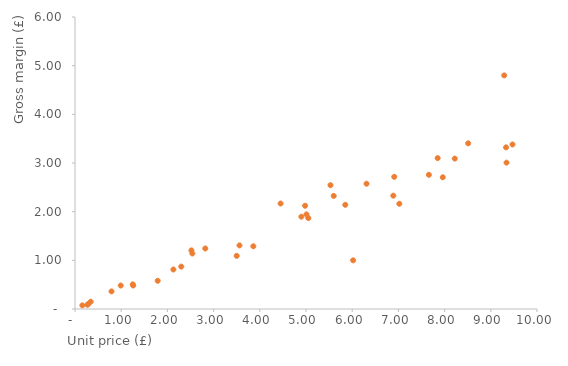
| Category |  Gross margin  |
|---|---|
| 3.56 | 1.307 |
| 6.89 | 2.329 |
| 3.86 | 1.289 |
| 5.01 | 1.944 |
| 4.98 | 2.121 |
| 0.29 | 0.107 |
| 6.91 | 2.716 |
| 2.54 | 1.14 |
| 5.05 | 1.868 |
| 2.13 | 0.812 |
| 5.6 | 2.324 |
| 5.85 | 2.141 |
| 2.52 | 1.205 |
| 7.85 | 3.101 |
| 8.22 | 3.091 |
| 8.51 | 3.404 |
| 6.02 | 1 |
| 7.96 | 2.706 |
| 1.26 | 0.483 |
| 4.45 | 2.167 |
| 7.66 | 2.758 |
| 9.47 | 3.381 |
| 7.02 | 2.162 |
| 0.79 | 0.362 |
| 4.9 | 1.896 |
| 0.16 | 0.074 |
| 1.25 | 0.506 |
| 0.27 | 0.087 |
| 0.99 | 0.482 |
| 0.34 | 0.15 |
| 6.31 | 2.574 |
| 2.82 | 1.244 |
| 5.53 | 2.544 |
| 2.3 | 0.872 |
| 9.34 | 3.007 |
| 9.29 | 4.8 |
| 9.33 | 3.321 |
| 1.79 | 0.58 |
| 3.5 | 1.092 |